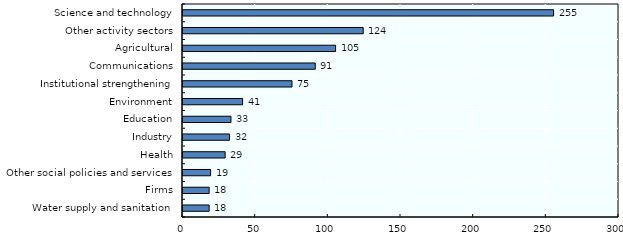
| Category | Series 0 |
|---|---|
| Water supply and sanitation | 18 |
| Firms | 18 |
| Other social policies and services | 19 |
| Health | 29 |
| Industry | 32 |
| Education | 33 |
| Environment | 41 |
| Institutional strengthening | 75 |
| Communications | 91 |
| Agricultural | 105 |
| Other activity sectors | 124 |
| Science and technology | 255 |